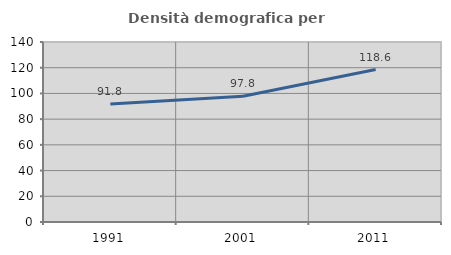
| Category | Densità demografica |
|---|---|
| 1991.0 | 91.839 |
| 2001.0 | 97.811 |
| 2011.0 | 118.574 |